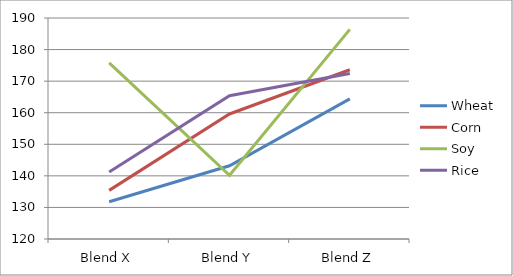
| Category | Wheat | Corn | Soy | Rice |
|---|---|---|---|---|
| Blend X | 131.8 | 135.4 | 175.8 | 141.2 |
| Blend Y | 143.2 | 159.6 | 140.2 | 165.4 |
| Blend Z | 164.4 | 173.6 | 186.4 | 172.4 |